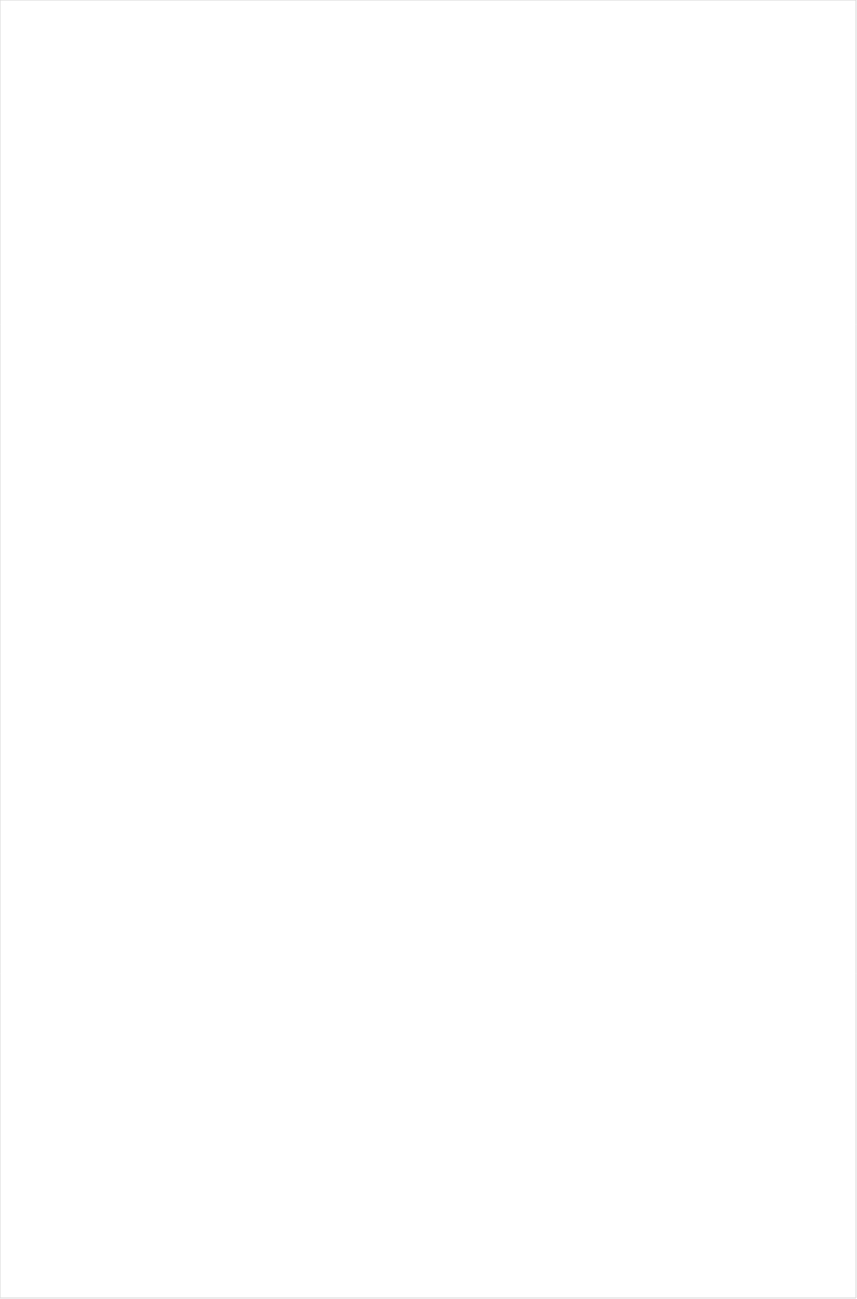
| Category | Total |
|---|---|
| RFD TV | -0.627 |
| Hallmark Movies & Mysteries | -0.532 |
| Univision | -0.509 |
| Hallmark | -0.465 |
| UniMas | -0.456 |
| Telemundo | -0.45 |
| Travel | -0.396 |
| UP TV | -0.394 |
| PBS | -0.368 |
| CMTV | -0.335 |
| NBC Universo | -0.327 |
| Galavision | -0.326 |
| Science Channel | -0.325 |
| Great American Country | -0.31 |
| Fox News | -0.297 |
| Discovery Life Channel | -0.269 |
| History Channel | -0.262 |
| WGN America | -0.248 |
| Logo | -0.239 |
| CBS | -0.2 |
| Fox Business | -0.198 |
| Animal Planet | -0.19 |
| Cartoon Network | -0.177 |
| ION | -0.161 |
| Investigation Discovery | -0.142 |
| Smithsonian | -0.137 |
| OXYGEN | -0.133 |
| TLC | -0.132 |
| POP | -0.132 |
| DIY | -0.128 |
| TV LAND | -0.118 |
| NBC | -0.118 |
| MyNetworkTV | -0.105 |
| INSP | -0.105 |
| Discovery Family Channel | -0.101 |
| Motor Trend Network | -0.093 |
| Discovery Channel | -0.09 |
| Outdoor Channel | -0.074 |
| HGTV | -0.054 |
| Ovation | -0.053 |
| SundanceTV | -0.041 |
| FOX | -0.03 |
| Weather Channel | -0.019 |
| American Heroes Channel | -0.012 |
| ABC | -0.012 |
| Headline News | 0.002 |
| The Sportsman Channel | 0.006 |
| Destination America | 0.029 |
| CW | 0.031 |
| Nick@Nite | 0.032 |
| TUDN | 0.033 |
| National Geographic Wild | 0.036 |
| BRAVO | 0.062 |
| FYI | 0.069 |
| Freeform | 0.077 |
| E! | 0.088 |
| Food Network | 0.107 |
| National Geographic | 0.124 |
| Disney Junior US | 0.131 |
| FX Movie Channel | 0.137 |
| Nick | 0.138 |
| Disney XD | 0.146 |
| Universal Kids | 0.147 |
| Lifetime Movies | 0.154 |
| TBS | 0.158 |
| Disney Channel | 0.168 |
| WE TV | 0.168 |
| A&E | 0.171 |
| AMC | 0.174 |
| Nick Jr. | 0.187 |
| Reelz Channel | 0.189 |
| Adult Swim | 0.2 |
| Nick Toons | 0.201 |
| SYFY | 0.207 |
| Independent Film (IFC) | 0.22 |
| Lifetime | 0.224 |
| Game Show | 0.298 |
| MTV | 0.325 |
| BBC America | 0.348 |
| MSNBC | 0.354 |
| Cooking Channel | 0.356 |
| Oprah Winfrey Network | 0.372 |
| FX | 0.393 |
| Bloomberg HD | 0.405 |
| FXX | 0.415 |
| Paramount Network | 0.443 |
| Teen Nick | 0.478 |
| Comedy Central | 0.486 |
| CNBC | 0.502 |
| truTV | 0.517 |
| Viceland | 0.525 |
| USA Network | 0.545 |
| Olympic Channel | 0.562 |
| NHL | 0.57 |
| TNT | 0.599 |
| FXDEP | 0.751 |
| CNN | 0.765 |
| Big Ten Network | 0.878 |
| Golf | 0.986 |
| FOX Sports 2 | 1.039 |
| BET | 1.134 |
| VH1 | 1.171 |
| CBS Sports | 1.306 |
| MLB Network | 1.393 |
| MTV2 | 1.492 |
| TV ONE | 1.518 |
| BET Her | 1.576 |
| Tennis Channel | 1.812 |
| PAC-12 Network | 1.819 |
| ESPN Deportes | 1.845 |
| NBC Sports | 1.945 |
| Fox Sports 1 | 1.978 |
| ESPNU | 2.13 |
| ESPNEWS | 2.46 |
| NFL Network | 2.502 |
| ESPN2 | 2.895 |
| ESPN | 3.104 |
| NBA TV | 7.275 |